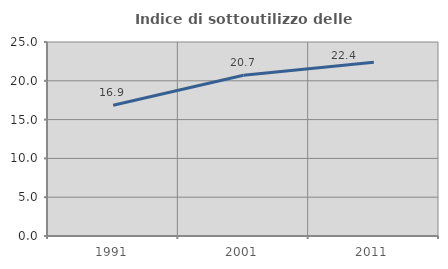
| Category | Indice di sottoutilizzo delle abitazioni  |
|---|---|
| 1991.0 | 16.858 |
| 2001.0 | 20.715 |
| 2011.0 | 22.381 |